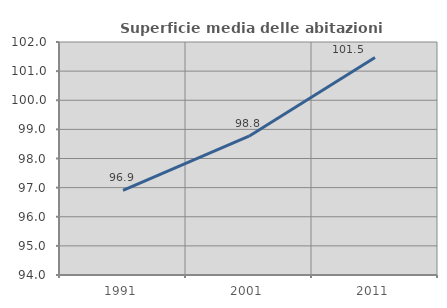
| Category | Superficie media delle abitazioni occupate |
|---|---|
| 1991.0 | 96.905 |
| 2001.0 | 98.767 |
| 2011.0 | 101.471 |